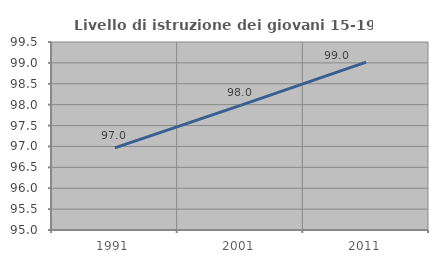
| Category | Livello di istruzione dei giovani 15-19 anni |
|---|---|
| 1991.0 | 96.968 |
| 2001.0 | 97.983 |
| 2011.0 | 99.016 |